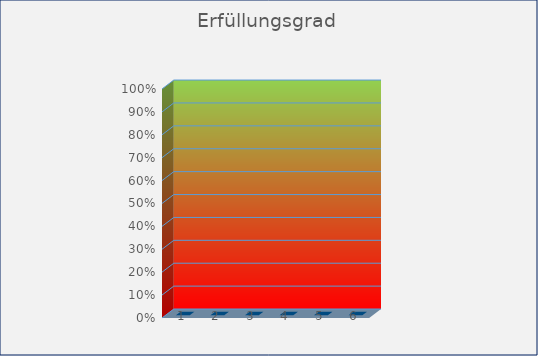
| Category | Erfüllungsgrad |
|---|---|
| Allgemeine Voraussetzungen | 0 |
| Verfahrensübersicht Datenschutz | 0 |
| Verarbeitung personenbezogener Daten | 0 |
| Datensicherheit | 0 |
| web-Sicherheit | 0 |
| Datenschutz-Organisation | 0 |